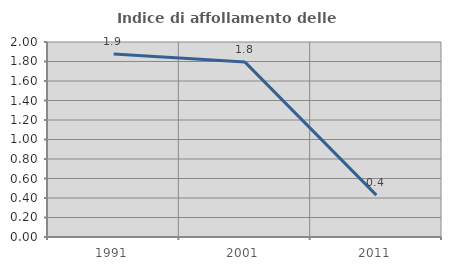
| Category | Indice di affollamento delle abitazioni  |
|---|---|
| 1991.0 | 1.878 |
| 2001.0 | 1.794 |
| 2011.0 | 0.429 |